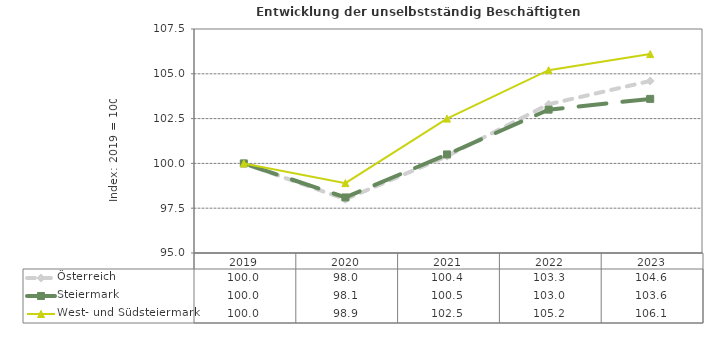
| Category | Österreich | Steiermark | West- und Südsteiermark |
|---|---|---|---|
| 2023.0 | 104.6 | 103.6 | 106.1 |
| 2022.0 | 103.3 | 103 | 105.2 |
| 2021.0 | 100.4 | 100.5 | 102.5 |
| 2020.0 | 98 | 98.1 | 98.9 |
| 2019.0 | 100 | 100 | 100 |